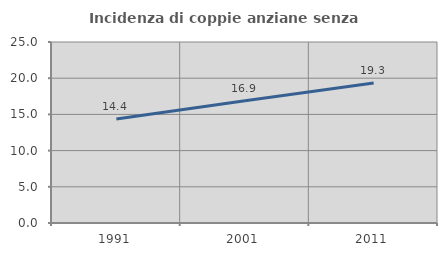
| Category | Incidenza di coppie anziane senza figli  |
|---|---|
| 1991.0 | 14.352 |
| 2001.0 | 16.883 |
| 2011.0 | 19.328 |